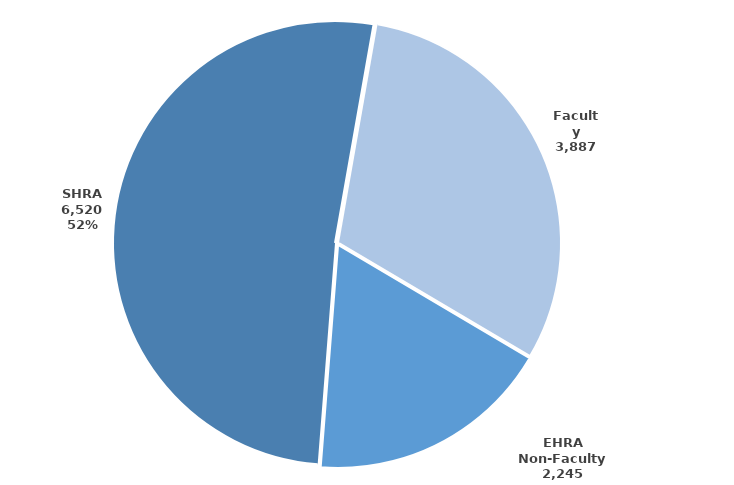
| Category | Series 0 |
|---|---|
| Faculty | 3887 |
| EHRA Non-Faculty | 2245 |
| SHRA | 6520 |